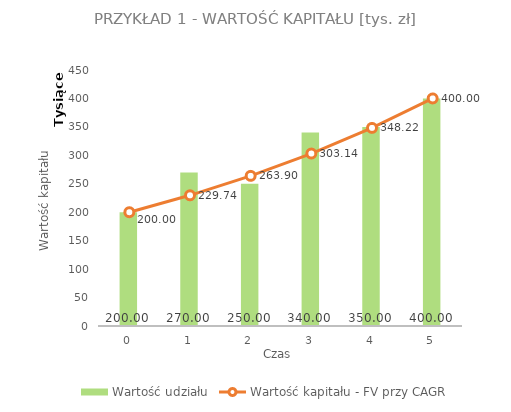
| Category | Wartość udziału |
|---|---|
| 0.0 | 200000 |
| 1.0 | 270000 |
| 2.0 | 250000 |
| 3.0 | 340000 |
| 4.0 | 350000 |
| 5.0 | 400000 |